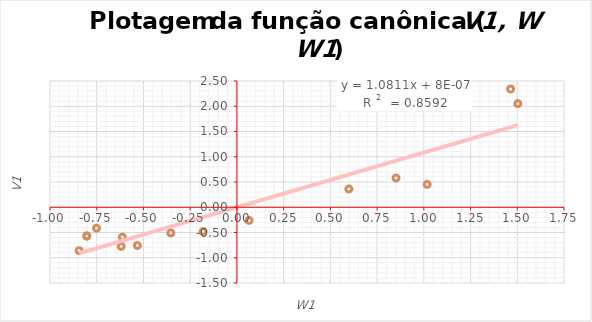
| Category | V1 |
|---|---|
| -0.8441550543999998 | -0.859 |
| -0.8033781727 | -0.572 |
| -0.8026835281 | -0.566 |
| -0.7511589374000001 | -0.415 |
| -0.6128793824000001 | -0.592 |
| -0.6191548053 | -0.775 |
| -0.5326671615 | -0.757 |
| -0.35400410590000003 | -0.508 |
| -0.18036477020000002 | -0.481 |
| 0.06527343999999997 | -0.26 |
| 0.5988757835999999 | 0.362 |
| 1.0178873578999998 | 0.452 |
| 0.8512880189 | 0.578 |
| 1.5029513903999998 | 2.053 |
| 1.4641632396 | 2.34 |